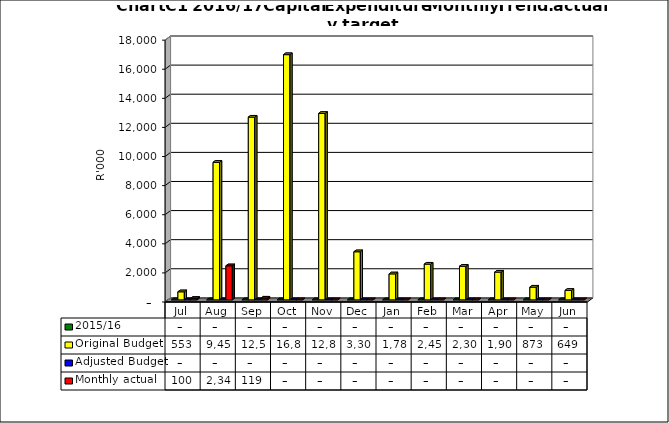
| Category | 2015/16 | Original Budget | Adjusted Budget | Monthly actual |
|---|---|---|---|---|
| Jul | 0 | 553000 | 0 | 99617 |
| Aug | 0 | 9453416.33 | 0 | 2340083.45 |
| Sep | 0 | 12558816.33 | 0 | 119094 |
| Oct | 0 | 16853416.333 | 0 | 0 |
| Nov | 0 | 12813416.33 | 0 | 0 |
| Dec | 0 | 3304173.83 | 0 | 0 |
| Jan | 0 | 1783416.33 | 0 | 0 |
| Feb | 0 | 2453416.327 | 0 | 0 |
| Mar | 0 | 2308816.33 | 0 | 0 |
| Apr | 0 | 1903416.327 | 0 | 0 |
| May | 0 | 873416.327 | 0 | 0 |
| Jun | 0 | 648820.377 | 0 | 0 |